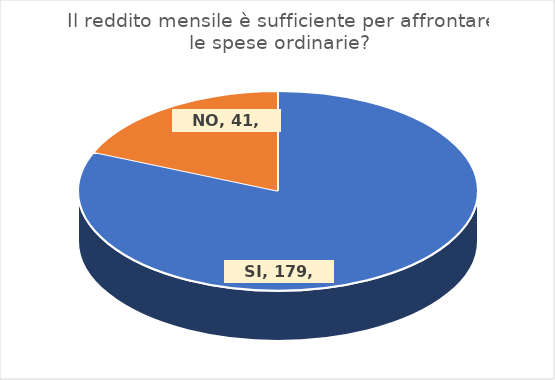
| Category | Series 0 |
|---|---|
| SI | 179 |
| NO | 41 |